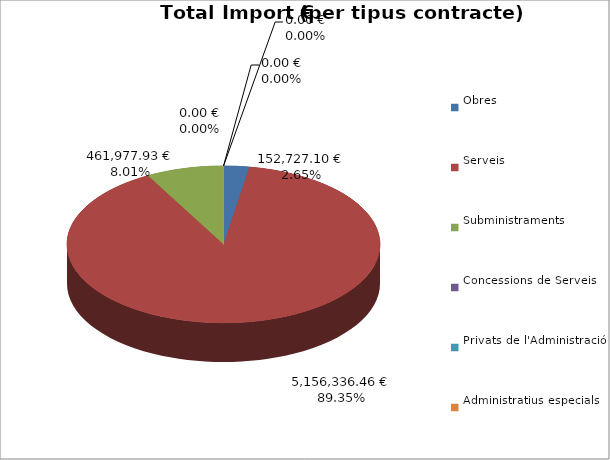
| Category | Total preu
(amb IVA) |
|---|---|
| Obres | 152727.1 |
| Serveis | 5156336.46 |
| Subministraments | 461977.93 |
| Concessions de Serveis | 0 |
| Privats de l'Administració | 0 |
| Administratius especials | 0 |